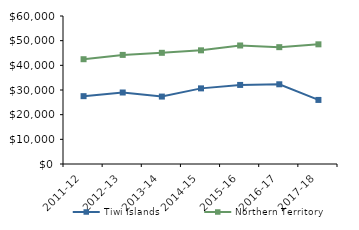
| Category | Tiwi Islands | Northern Territory |
|---|---|---|
| 2011-12 | 27503.75 | 42481 |
| 2012-13 | 28987.89 | 44232.02 |
| 2013-14 | 27337 | 45075.51 |
| 2014-15 | 30661 | 46083.65 |
| 2015-16 | 32056 | 48046.27 |
| 2016-17 | 32316.62 | 47367.05 |
| 2017-18 | 25974.15 | 48519 |